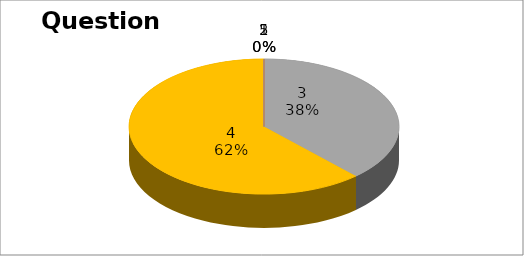
| Category | Series 0 |
|---|---|
| 0 | 0 |
| 1 | 0 |
| 2 | 8 |
| 3 | 13 |
| 4 | 0 |